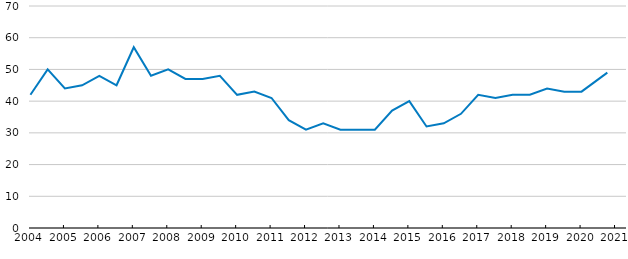
| Category | European Union, 28 countries |
|---|---|
| 2004-06-01 | 42 |
| 2004-12-01 | 50 |
| 2005-06-01 | 44 |
| 2005-12-01 | 45 |
| 2006-06-01 | 48 |
| 2006-12-01 | 45 |
| 2007-06-01 | 57 |
| 2007-12-01 | 48 |
| 2008-06-01 | 50 |
| 2008-12-01 | 47 |
| 2009-06-01 | 47 |
| 2009-12-01 | 48 |
| 2010-06-01 | 42 |
| 2010-12-01 | 43 |
| 2011-06-01 | 41 |
| 2011-12-01 | 34 |
| 2012-06-01 | 31 |
| 2012-12-01 | 33 |
| 2013-06-01 | 31 |
| 2013-12-01 | 31 |
| 2014-06-01 | 31 |
| 2014-12-01 | 37 |
| 2015-06-01 | 40 |
| 2015-12-01 | 32 |
| 2016-06-01 | 33 |
| 2016-12-01 | 36 |
| 2017-06-01 | 42 |
| 2017-12-01 | 41 |
| 2018-06-01 | 42 |
| 2018-12-01 | 42 |
| 2019-06-01 | 44 |
| 2019-12-01 | 43 |
| 2020-06-01 | 43 |
| 2021-03-01 | 49 |